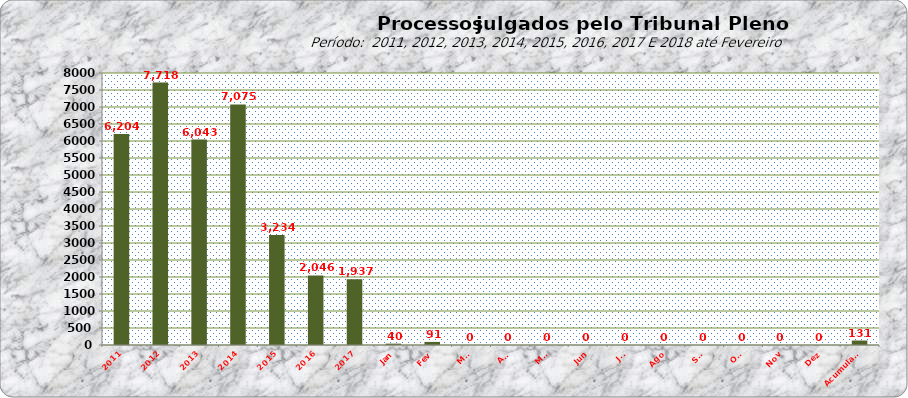
| Category | Series 0 |
|---|---|
| 2011 | 6204 |
| 2012 | 7718 |
| 2013 | 6043 |
| 2014 | 7075 |
| 2015 | 3234 |
| 2016 | 2046 |
| 2017 | 1937 |
| Jan | 40 |
| Fev | 91 |
| Mar | 0 |
| Abr | 0 |
| Mai | 0 |
| Jun | 0 |
| Jul | 0 |
| Ago | 0 |
| Set | 0 |
| Out | 0 |
| Nov | 0 |
| Dez | 0 |
| Acumulado | 131 |